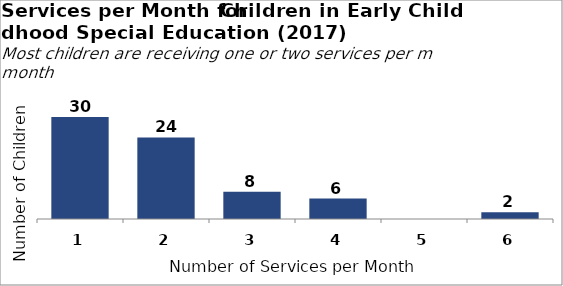
| Category | Frequency |
|---|---|
| 1 | 30 |
| 2 | 24 |
| 3 | 8 |
| 4 | 6 |
| 5 | 0 |
| 6 | 2 |